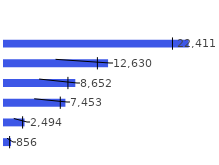
| Category | Продажи |
|---|---|
| Rubok | 856.285 |
| Babidas | 2494.022 |
| Gunverse | 7452.573 |
| Nuke | 8652.307 |
| Asic | 12630.31 |
| Galosha | 22410.694 |